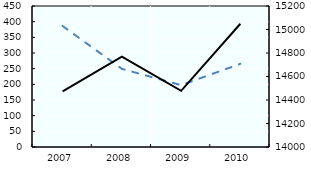
| Category | IS |
|---|---|
| 2007.0 | 386.119 |
| 2008.0 | 249.395 |
| 2009.0 | 197.471 |
| 2010.0 | 265.481 |